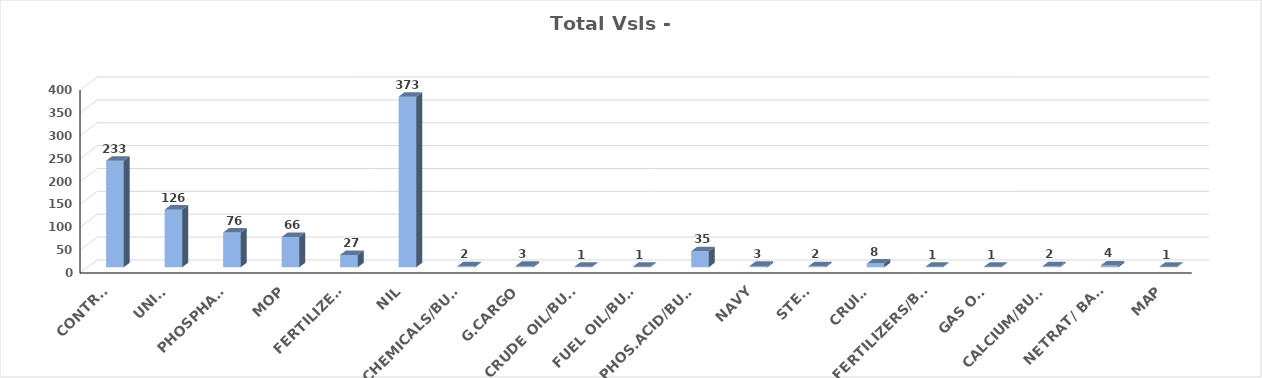
| Category | Series 0 |
|---|---|
| CONTRS. | 233 |
| UNITS | 126 |
| PHOSPHATE | 76 |
| MOP | 66 |
| FERTILIZERS | 27 |
| NIL | 373 |
| CHEMICALS/BULK | 2 |
| G.CARGO | 3 |
| CRUDE OIL/BULK | 1 |
| FUEL OIL/BULK | 1 |
| PHOS.ACID/BULK | 35 |
| NAVY | 3 |
| STEEL | 2 |
| CRUISE | 8 |
| FERTILIZERS/BAGS | 1 |
| GAS OIL | 1 |
| CALCIUM/BULK | 2 |
| NETRAT/ BAGS | 4 |
| MAP | 1 |